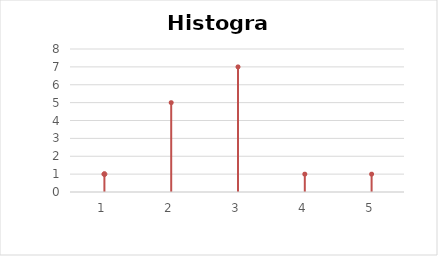
| Category | počet žiakov |
|---|---|
| 0 | 1 |
| 1 | 5 |
| 2 | 7 |
| 3 | 1 |
| 4 | 1 |